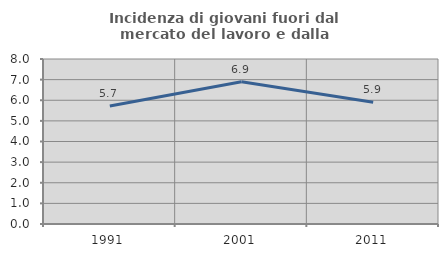
| Category | Incidenza di giovani fuori dal mercato del lavoro e dalla formazione  |
|---|---|
| 1991.0 | 5.717 |
| 2001.0 | 6.9 |
| 2011.0 | 5.907 |